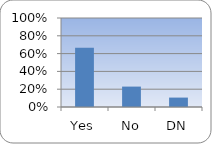
| Category | Series 0 |
|---|---|
| Yes | 0.665 |
| No | 0.229 |
| DN | 0.106 |